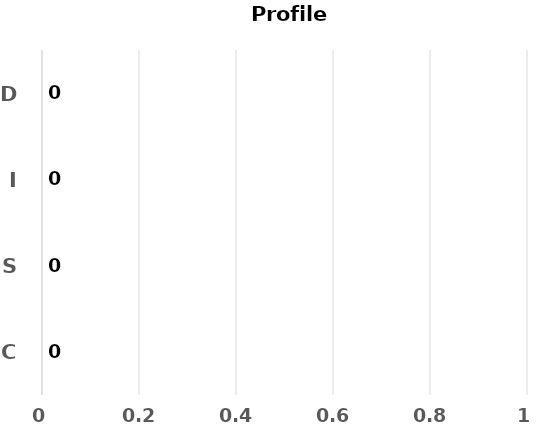
| Category | Profile Totals |
|---|---|
| C | 0 |
| S | 0 |
| I | 0 |
| D | 0 |